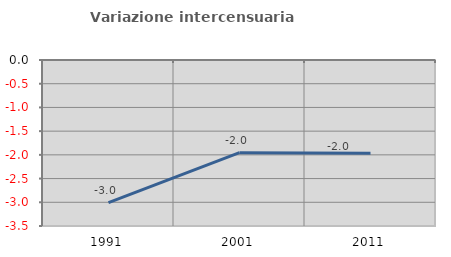
| Category | Variazione intercensuaria annua |
|---|---|
| 1991.0 | -3.006 |
| 2001.0 | -1.954 |
| 2011.0 | -1.965 |